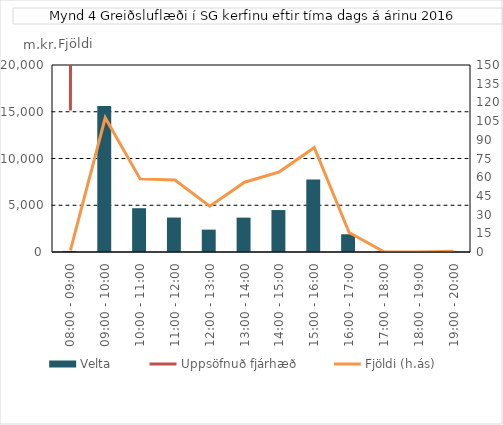
| Category | Velta |
|---|---|
| 08:00 - 09:00 | 113.463 |
| 09:00 - 10:00 | 15616.586 |
| 10:00 - 11:00 | 4681.006 |
| 11:00 - 12:00 | 3684.379 |
| 12:00 - 13:00 | 2392.132 |
| 13:00 - 14:00 | 3677.13 |
| 14:00 - 15:00 | 4487.031 |
| 15:00 - 16:00 | 7752.408 |
| 16:00 - 17:00 | 1898.141 |
| 17:00 - 18:00 | 96.722 |
| 18:00 - 19:00 | 0.007 |
| 19:00 - 20:00 | 22.405 |